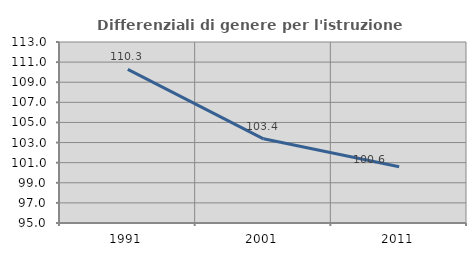
| Category | Differenziali di genere per l'istruzione superiore |
|---|---|
| 1991.0 | 110.271 |
| 2001.0 | 103.372 |
| 2011.0 | 100.587 |